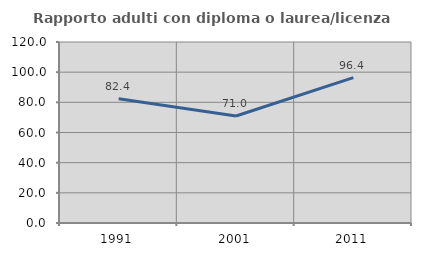
| Category | Rapporto adulti con diploma o laurea/licenza media  |
|---|---|
| 1991.0 | 82.353 |
| 2001.0 | 70.968 |
| 2011.0 | 96.429 |